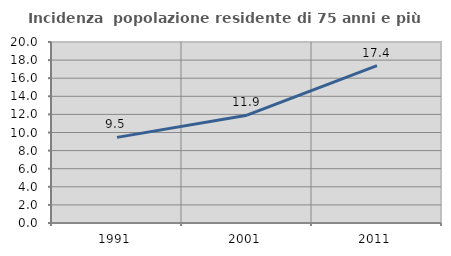
| Category | Incidenza  popolazione residente di 75 anni e più |
|---|---|
| 1991.0 | 9.459 |
| 2001.0 | 11.912 |
| 2011.0 | 17.391 |